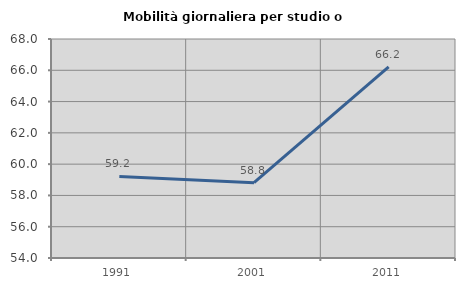
| Category | Mobilità giornaliera per studio o lavoro |
|---|---|
| 1991.0 | 59.211 |
| 2001.0 | 58.818 |
| 2011.0 | 66.224 |